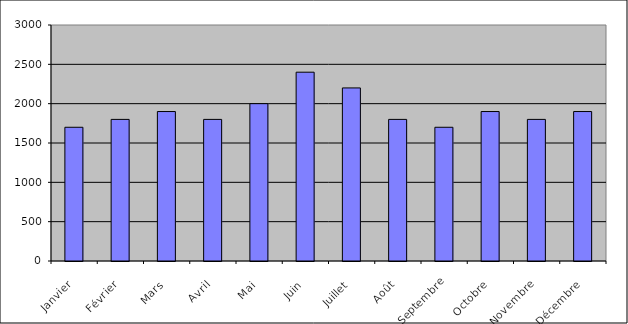
| Category | Series 0 |
|---|---|
| Janvier | 1700 |
| Février | 1800 |
| Mars | 1900 |
| Avril | 1800 |
| Mai | 2000 |
| Juin | 2400 |
| Juillet | 2200 |
| Août | 1800 |
| Septembre | 1700 |
| Octobre | 1900 |
| Novembre | 1800 |
| Décembre | 1900 |